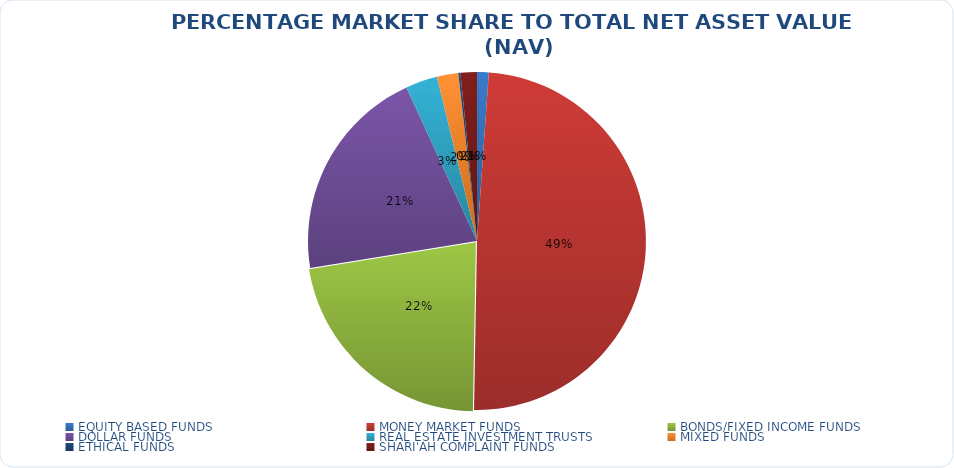
| Category | NET ASSET VALUE |
|---|---|
| EQUITY BASED FUNDS | 17010664326.75 |
| MONEY MARKET FUNDS | 748848468799.76 |
| BONDS/FIXED INCOME FUNDS | 337557374886.085 |
| DOLLAR FUNDS | 315347453563.14 |
| REAL ESTATE INVESTMENT TRUSTS | 46362288631.09 |
| MIXED FUNDS | 31120048445.682 |
| ETHICAL FUNDS | 3061691984.06 |
| SHARI'AH COMPLAINT FUNDS | 23850690692.21 |